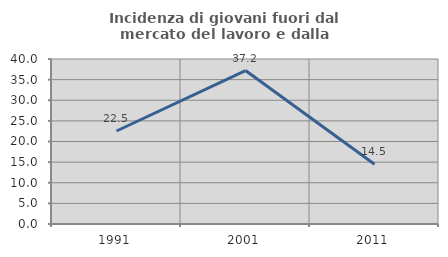
| Category | Incidenza di giovani fuori dal mercato del lavoro e dalla formazione  |
|---|---|
| 1991.0 | 22.545 |
| 2001.0 | 37.198 |
| 2011.0 | 14.474 |